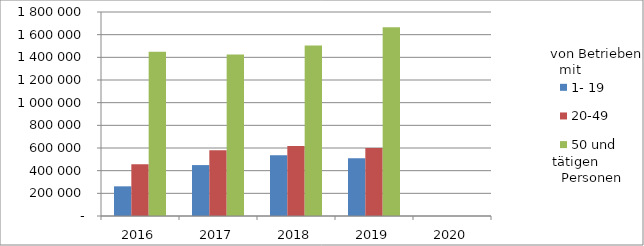
| Category | 1- 19 | 20-49 | 50 und mehr |
|---|---|---|---|
| 2016.0 | 261822.605 | 456254.347 | 1449929.516 |
| 2017.0 | 449238.155 | 579413.351 | 1425932.487 |
| 2018.0 | 536024.379 | 617872.882 | 1504659.932 |
| 2019.0 | 508788.577 | 600739.035 | 1666354.201 |
| 2020.0 | 0 | 0 | 0 |